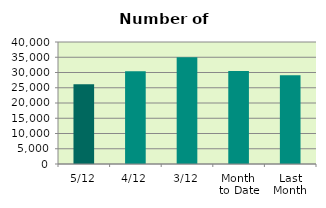
| Category | Series 0 |
|---|---|
| 5/12 | 26122 |
| 4/12 | 30396 |
| 3/12 | 34980 |
| Month 
to Date | 30498.667 |
| Last
Month | 29125.182 |